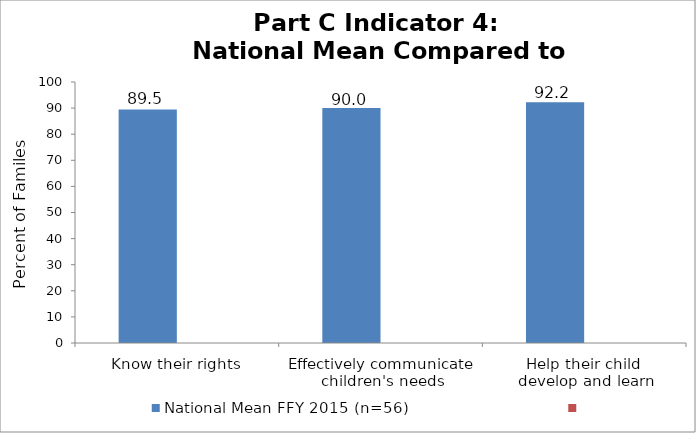
| Category | National Mean FFY 2015 (n=56) | Series 1 |
|---|---|---|
| Know their rights | 89.5 |  |
| Effectively communicate 
children's needs | 90 |  |
| Help their child 
develop and learn | 92.2 |  |